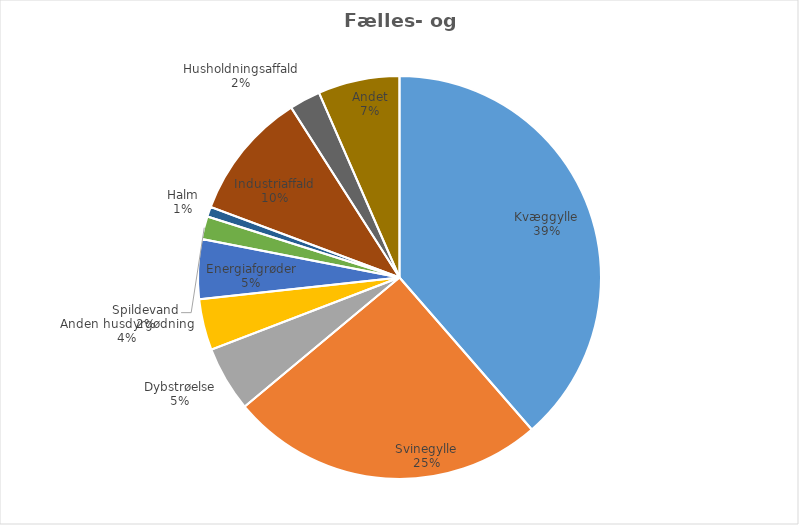
| Category | Series 0 |
|---|---|
| Kvæggylle | 2727802.82 |
| Svinegylle | 1790681.53 |
| Dybstrøelse | 369833.07 |
| Anden husdyrgødning | 289515.8 |
| Energiafgrøder | 338489.59 |
| Spildevand | 129425 |
| Halm | 56321.35 |
| Industriaffald | 726263.95 |
| Husholdningsaffald | 176190.7 |
| Andet | 462170.49 |